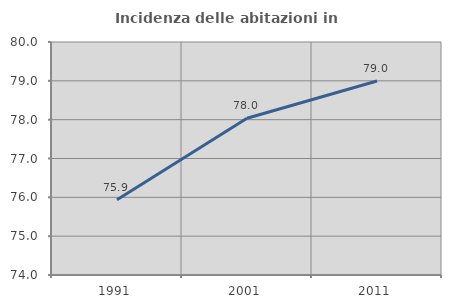
| Category | Incidenza delle abitazioni in proprietà  |
|---|---|
| 1991.0 | 75.936 |
| 2001.0 | 78.037 |
| 2011.0 | 78.995 |